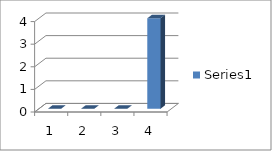
| Category | Series 0 |
|---|---|
| 0 | 0 |
| 1 | 0 |
| 2 | 0 |
| 3 | 4 |